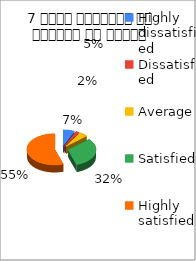
| Category | 7 विषय अवधारणा पर शिक्षक का ज्ञान  |
|---|---|
| Highly dissatisfied | 4 |
| Dissatisfied | 1 |
| Average | 3 |
| Satisfied | 19 |
| Highly satisfied | 33 |